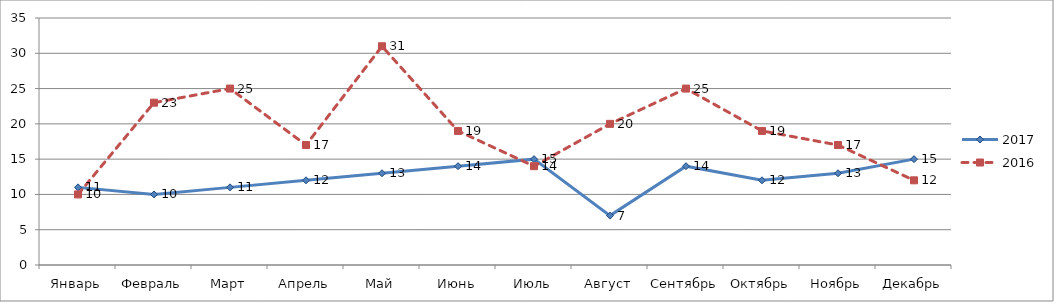
| Category | 2017 | 2016 |
|---|---|---|
| Январь | 11 | 10 |
| Февраль | 10 | 23 |
| Март | 11 | 25 |
| Апрель | 12 | 17 |
| Май | 13 | 31 |
| Июнь | 14 | 19 |
| Июль | 15 | 14 |
| Август | 7 | 20 |
| Сентябрь | 14 | 25 |
| Октябрь | 12 | 19 |
| Ноябрь | 13 | 17 |
| Декабрь | 15 | 12 |